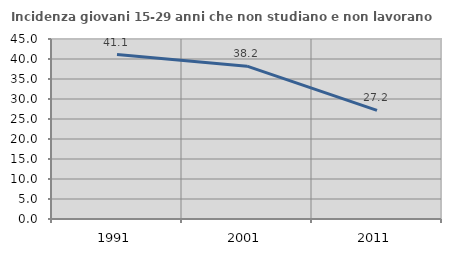
| Category | Incidenza giovani 15-29 anni che non studiano e non lavorano  |
|---|---|
| 1991.0 | 41.111 |
| 2001.0 | 38.21 |
| 2011.0 | 27.163 |